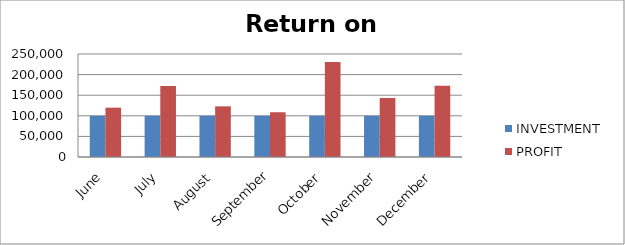
| Category | INVESTMENT  | PROFIT |
|---|---|---|
| June | 100000 | 119705 |
| July | 100000 | 172291 |
| August | 100000 | 122944 |
| September | 100000 | 108627 |
| October | 100000 | 230487 |
| November | 100000 | 143076 |
| December | 100000 | 172860 |